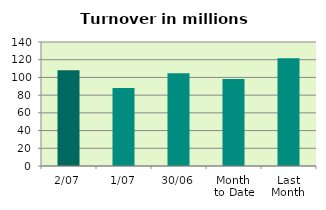
| Category | Series 0 |
|---|---|
| 2/07 | 108.072 |
| 1/07 | 88.131 |
| 30/06 | 104.737 |
| Month 
to Date | 98.101 |
| Last
Month | 121.74 |